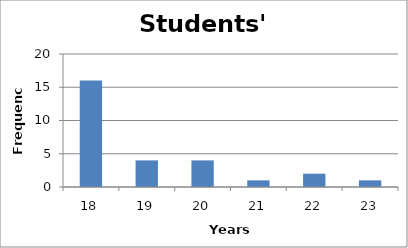
| Category | Series 0 |
|---|---|
| 18.0 | 16 |
| 19.0 | 4 |
| 20.0 | 4 |
| 21.0 | 1 |
| 22.0 | 2 |
| 23.0 | 1 |